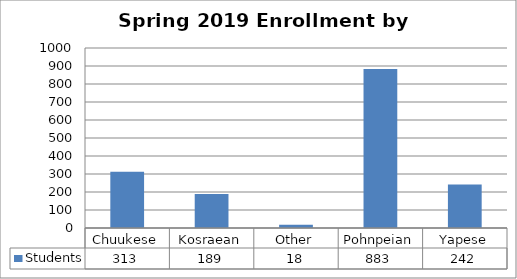
| Category | Students |
|---|---|
| Chuukese | 313 |
| Kosraean | 189 |
| Other | 18 |
| Pohnpeian | 883 |
| Yapese | 242 |